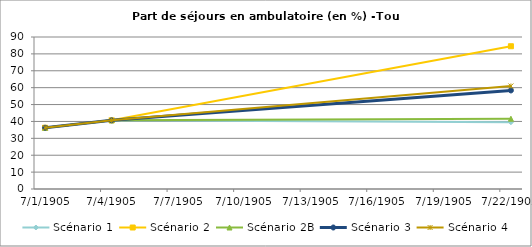
| Category | Scénario 1 | Scénario 2 | Scénario 2B | Scénario 3 | Scénario 4 |
|---|---|---|---|---|---|
| 2009.0 | 36.27 | 36.27 | 36.27 | 36.27 | 36.27 |
| 2012.0 | 40.656 | 40.656 | 40.656 | 40.656 | 40.656 |
| 2030.0 | 39.541 | 84.524 | 41.609 | 58.357 | 60.99 |